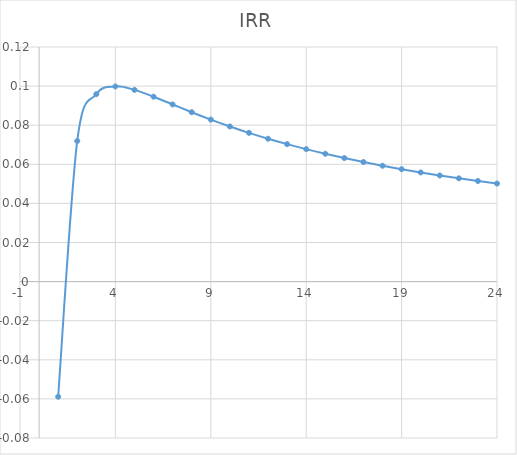
| Category | IRR |
|---|---|
| 1.0 | -0.059 |
| 2.0 | 0.072 |
| 3.0 | 0.096 |
| 4.0 | 0.1 |
| 5.0 | 0.098 |
| 6.0 | 0.095 |
| 7.0 | 0.091 |
| 8.0 | 0.087 |
| 9.0 | 0.083 |
| 10.0 | 0.079 |
| 11.0 | 0.076 |
| 12.0 | 0.073 |
| 13.0 | 0.07 |
| 14.0 | 0.068 |
| 15.0 | 0.065 |
| 16.0 | 0.063 |
| 17.0 | 0.061 |
| 18.0 | 0.059 |
| 19.0 | 0.057 |
| 20.0 | 0.056 |
| 21.0 | 0.054 |
| 22.0 | 0.053 |
| 23.0 | 0.051 |
| 24.0 | 0.05 |
| 25.0 | 0.049 |